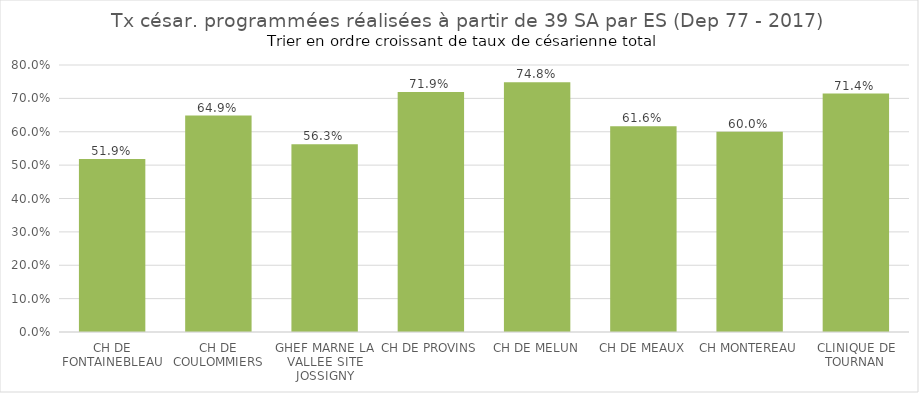
| Category | Tx césar. programmées 
réalisées à partir de 39 SA |
|---|---|
| CH DE FONTAINEBLEAU | 0.519 |
| CH DE COULOMMIERS | 0.649 |
| GHEF MARNE LA VALLEE SITE JOSSIGNY | 0.563 |
| CH DE PROVINS | 0.719 |
| CH DE MELUN | 0.748 |
| CH DE MEAUX | 0.616 |
| CH MONTEREAU | 0.6 |
| CLINIQUE DE TOURNAN | 0.714 |